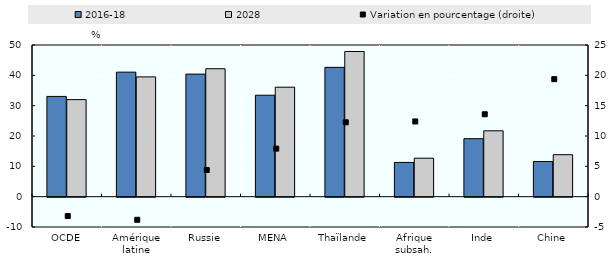
| Category | 2016-18 | 2028 |
|---|---|---|
| OCDE | 33.053 | 31.996 |
| Amérique latine | 41.052 | 39.487 |
| Russie | 40.401 | 42.173 |
| MENA | 33.44 | 36.088 |
| Thaïlande | 42.629 | 47.855 |
| Afrique subsah. | 11.287 | 12.687 |
| Inde | 19.117 | 21.714 |
| Chine | 11.591 | 13.837 |